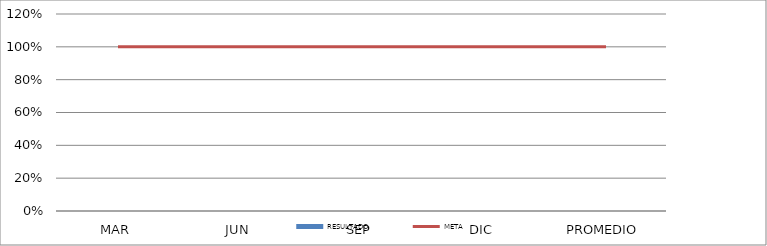
| Category | RESULTADO |
|---|---|
| MAR | 0 |
| JUN | 0 |
| SEP | 0 |
| DIC | 0 |
| PROMEDIO | 0 |